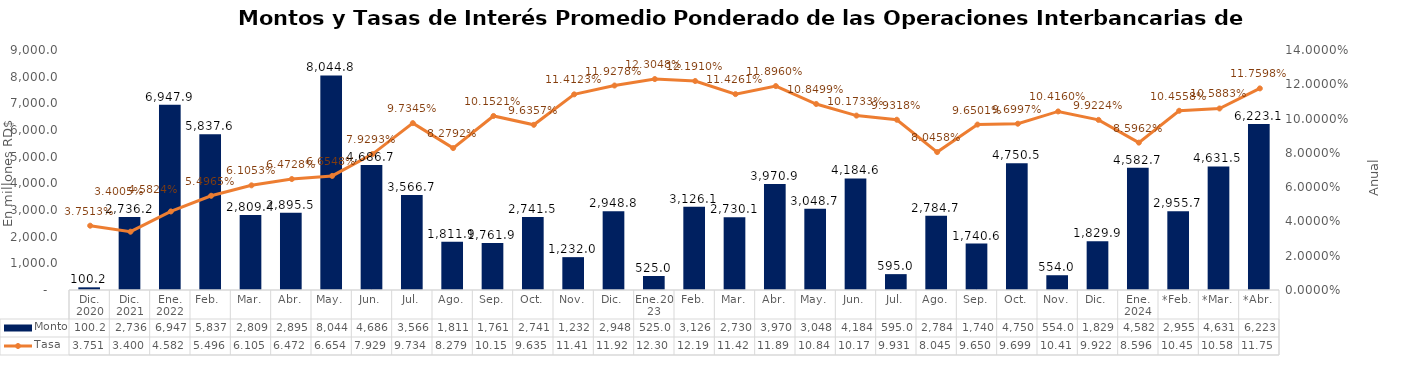
| Category | Monto |
|---|---|
| Dic. 2020 | 100.201 |
| Dic. 2021 | 2736.2 |
| Ene. 2022 | 6947.9 |
| Feb.  | 5837.6 |
| Mar. | 2809.4 |
| Abr. | 2895.51 |
| May. | 8044.816 |
| Jun. | 4686.669 |
| Jul. | 3566.685 |
| Ago. | 1811.857 |
| Sep. | 1761.897 |
| Oct. | 2741.5 |
| Nov. | 1231.977 |
| Dic. | 2948.8 |
| Ene.2023 | 525 |
| Feb. | 3126.05 |
| Mar. | 2730.1 |
| Abr. | 3970.921 |
| May. | 3048.675 |
| Jun. | 4184.629 |
| Jul. | 595 |
| Ago. | 2784.7 |
| Sep. | 1740.568 |
| Oct. | 4750.52 |
| Nov. | 554.01 |
| Dic. | 1829.874 |
| Ene. 2024 | 4582.692 |
| *Feb. | 2955.7 |
| *Mar. | 4631.5 |
| *Abr. | 6223.094 |